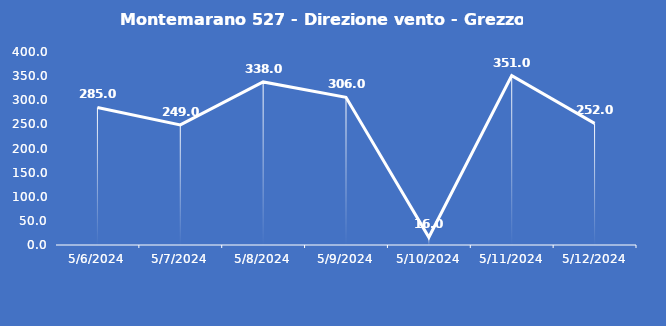
| Category | Montemarano 527 - Direzione vento - Grezzo (°N) |
|---|---|
| 5/6/24 | 285 |
| 5/7/24 | 249 |
| 5/8/24 | 338 |
| 5/9/24 | 306 |
| 5/10/24 | 16 |
| 5/11/24 | 351 |
| 5/12/24 | 252 |